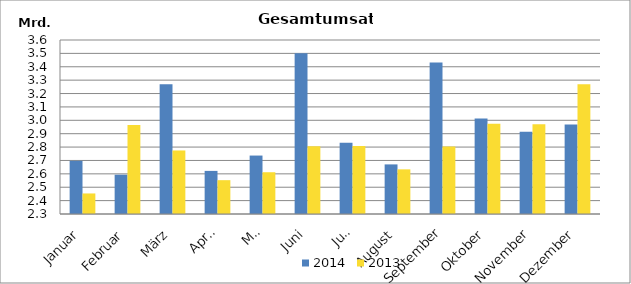
| Category | 2014 | 2013 |
|---|---|---|
| Januar | 2697405.528 | 2453498.457 |
| Februar | 2593574.427 | 2964031.539 |
| März | 3270189.566 | 2774657.891 |
| April | 2622055.161 | 2552707.033 |
| Mai | 2736653.495 | 2612048.516 |
| Juni | 3501003.503 | 2806904.546 |
| Juli | 2832647.63 | 2808175.655 |
| August | 2670574.006 | 2633545.98 |
| September | 3431306.761 | 2803890.263 |
| Oktober | 3014327.644 | 2974501.551 |
| November | 2914058.433 | 2969884.788 |
| Dezember | 2968288.317 | 3268552.593 |